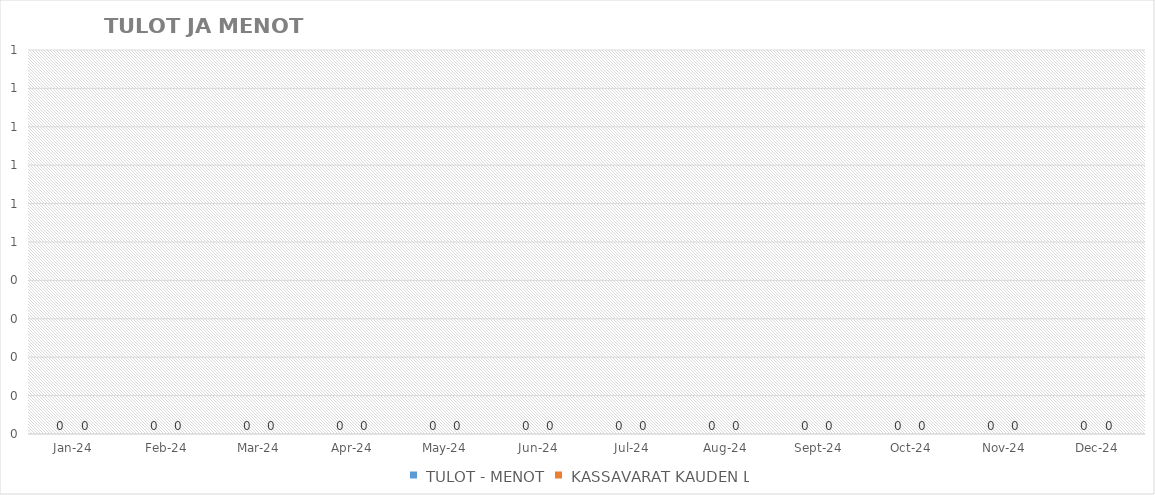
| Category |  TULOT - MENOT |  KASSAVARAT KAUDEN LOPUSSA |
|---|---|---|
| 2024-01-01 | 0 | 0 |
| 2024-02-01 | 0 | 0 |
| 2024-03-03 | 0 | 0 |
| 2024-04-03 | 0 | 0 |
| 2024-05-04 | 0 | 0 |
| 2024-06-04 | 0 | 0 |
| 2024-07-05 | 0 | 0 |
| 2024-08-05 | 0 | 0 |
| 2024-09-05 | 0 | 0 |
| 2024-10-06 | 0 | 0 |
| 2024-11-06 | 0 | 0 |
| 2024-12-07 | 0 | 0 |